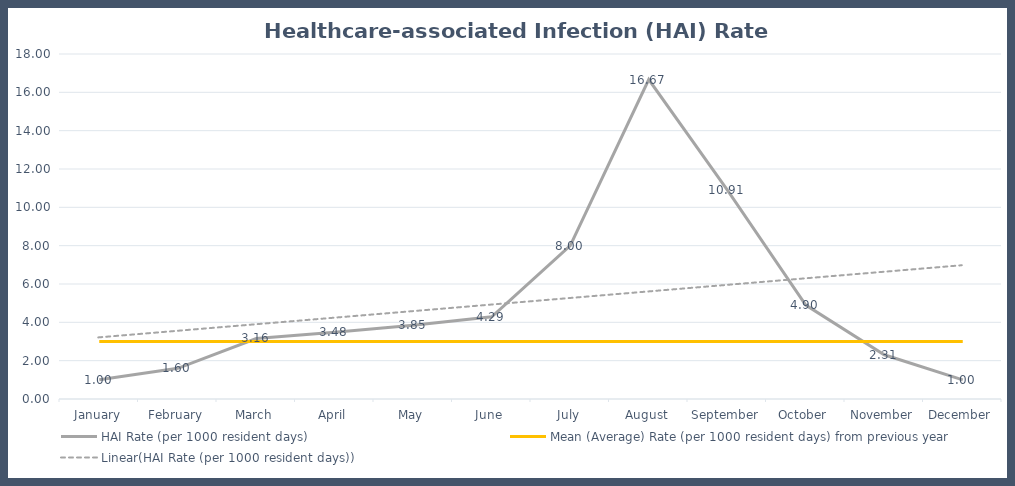
| Category | HAI Rate (per 1000 resident days) | Mean (Average) Rate (per 1000 resident days) from previous year |
|---|---|---|
| January | 1 | 3 |
| February | 1.6 | 3 |
| March | 3.158 | 3 |
| April | 3.478 | 3 |
| May | 3.846 | 3 |
| June | 4.286 | 3 |
| July | 8 | 3 |
| August | 16.667 | 3 |
| September | 10.909 | 3 |
| October | 4.898 | 3 |
| November | 2.308 | 3 |
| December | 1 | 3 |